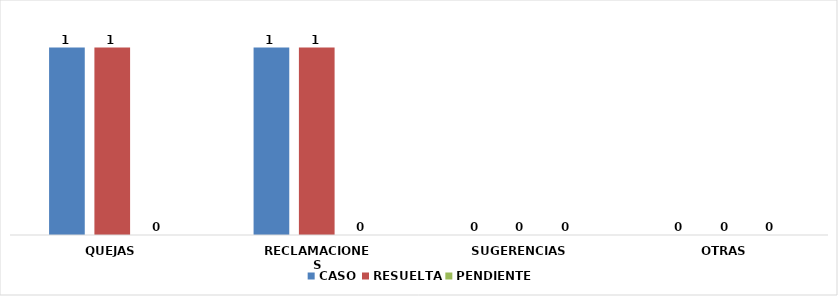
| Category | CASO | RESUELTA | PENDIENTE |
|---|---|---|---|
| QUEJAS | 1 | 1 | 0 |
| RECLAMACIONES | 1 | 1 | 0 |
| SUGERENCIAS | 0 | 0 | 0 |
| OTRAS | 0 | 0 | 0 |